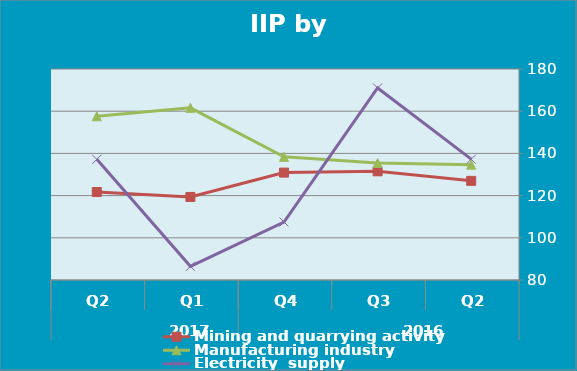
| Category | IIPالرقم القياسي العام  | Mining and quarrying activity | Manufacturing industry | Electricity  supply |
|---|---|---|---|---|
| 0 |  | 126.99 | 134.67 | 137.27 |
| 1 |  | 131.51 | 135.43 | 171 |
| 2 |  | 130.91 | 138.37 | 107.49 |
| 3 |  | 119.36 | 161.6 | 86.5 |
| 4 |  | 121.69 | 157.62 | 137.2 |